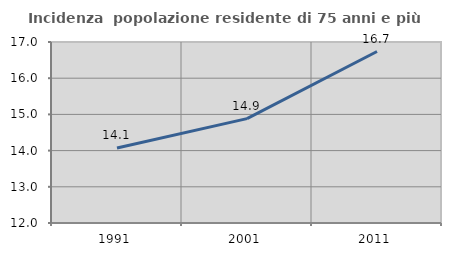
| Category | Incidenza  popolazione residente di 75 anni e più |
|---|---|
| 1991.0 | 14.07 |
| 2001.0 | 14.882 |
| 2011.0 | 16.737 |